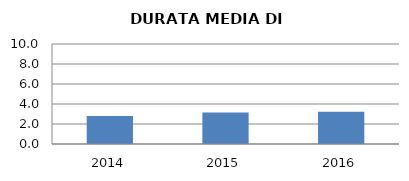
| Category | 2014 2015 2016 |
|---|---|
| 2014.0 | 2.811 |
| 2015.0 | 3.154 |
| 2016.0 | 3.222 |